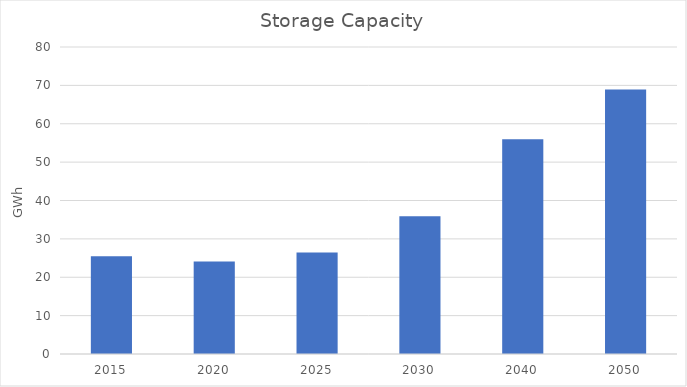
| Category | Series 0 |
|---|---|
| 2015.0 | 25.46 |
| 2020.0 | 24.12 |
| 2025.0 | 26.43 |
| 2030.0 | 35.864 |
| 2040.0 | 55.932 |
| 2050.0 | 68.95 |